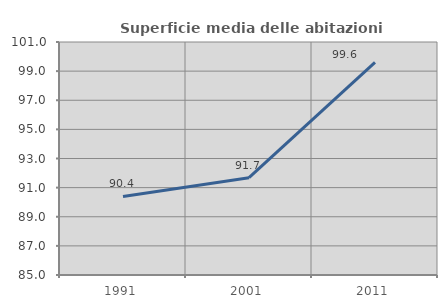
| Category | Superficie media delle abitazioni occupate |
|---|---|
| 1991.0 | 90.394 |
| 2001.0 | 91.682 |
| 2011.0 | 99.596 |